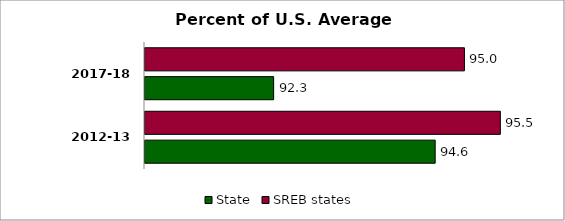
| Category | State | SREB states |
|---|---|---|
| 2012-13 | 94.613 | 95.537 |
| 2017-18 | 92.323 | 95.028 |